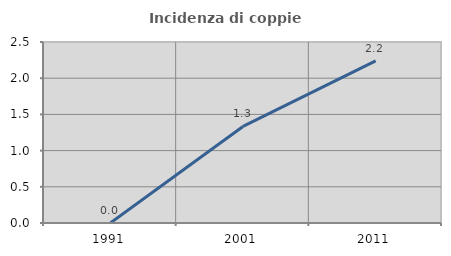
| Category | Incidenza di coppie miste |
|---|---|
| 1991.0 | 0 |
| 2001.0 | 1.333 |
| 2011.0 | 2.239 |